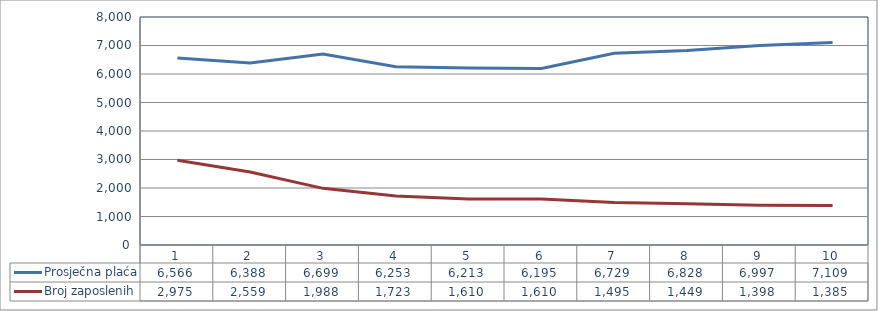
| Category | Prosječna plaća | Broj zaposlenih |
|---|---|---|
| 0 | 6565.652 | 2975 |
| 1 | 6388.48 | 2559 |
| 2 | 6698.636 | 1988 |
| 3 | 6253.493 | 1723 |
| 4 | 6213.119 | 1610 |
| 5 | 6195.115 | 1610 |
| 6 | 6729.469 | 1495 |
| 7 | 6828.442 | 1449 |
| 8 | 6996.832 | 1398 |
| 9 | 7109 | 1385 |